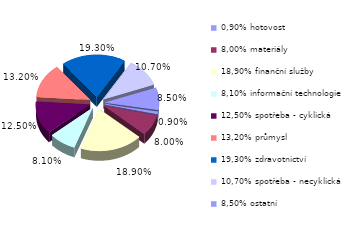
| Category | Series 0 |
|---|---|
| 0,90% hotovost | 0.009 |
| 8,00% materiály | 0.08 |
| 18,90% finanční služby | 0.189 |
| 8,10% informační technologie | 0.081 |
| 12,50% spotřeba - cyklická | 0.125 |
| 13,20% průmysl | 0.132 |
| 19,30% zdravotnictví | 0.193 |
| 10,70% spotřeba - necyklická | 0.107 |
| 8,50% ostatní | 0.085 |